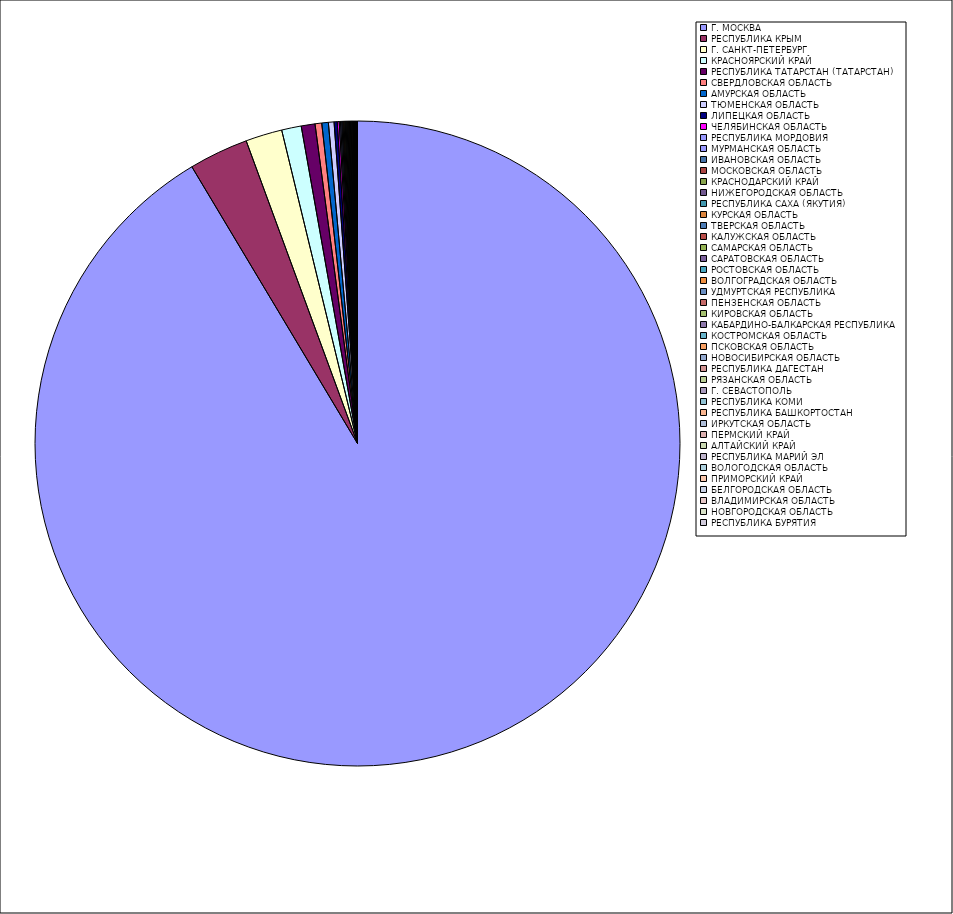
| Category | Оборот |
|---|---|
| Г. МОСКВА | 91.402 |
| РЕСПУБЛИКА КРЫМ | 2.975 |
| Г. САНКТ-ПЕТЕРБУРГ | 1.832 |
| КРАСНОЯРСКИЙ КРАЙ | 0.983 |
| РЕСПУБЛИКА ТАТАРСТАН (ТАТАРСТАН) | 0.689 |
| СВЕРДЛОВСКАЯ ОБЛАСТЬ | 0.335 |
| АМУРСКАЯ ОБЛАСТЬ | 0.328 |
| ТЮМЕНСКАЯ ОБЛАСТЬ | 0.283 |
| ЛИПЕЦКАЯ ОБЛАСТЬ | 0.157 |
| ЧЕЛЯБИНСКАЯ ОБЛАСТЬ | 0.097 |
| РЕСПУБЛИКА МОРДОВИЯ | 0.065 |
| МУРМАНСКАЯ ОБЛАСТЬ | 0.062 |
| ИВАНОВСКАЯ ОБЛАСТЬ | 0.055 |
| МОСКОВСКАЯ ОБЛАСТЬ | 0.054 |
| КРАСНОДАРСКИЙ КРАЙ | 0.053 |
| НИЖЕГОРОДСКАЯ ОБЛАСТЬ | 0.049 |
| РЕСПУБЛИКА САХА (ЯКУТИЯ) | 0.048 |
| КУРСКАЯ ОБЛАСТЬ | 0.043 |
| ТВЕРСКАЯ ОБЛАСТЬ | 0.042 |
| КАЛУЖСКАЯ ОБЛАСТЬ | 0.041 |
| САМАРСКАЯ ОБЛАСТЬ | 0.04 |
| САРАТОВСКАЯ ОБЛАСТЬ | 0.039 |
| РОСТОВСКАЯ ОБЛАСТЬ | 0.038 |
| ВОЛГОГРАДСКАЯ ОБЛАСТЬ | 0.038 |
| УДМУРТСКАЯ РЕСПУБЛИКА | 0.023 |
| ПЕНЗЕНСКАЯ ОБЛАСТЬ | 0.021 |
| КИРОВСКАЯ ОБЛАСТЬ | 0.018 |
| КАБАРДИНО-БАЛКАРСКАЯ РЕСПУБЛИКА | 0.017 |
| КОСТРОМСКАЯ ОБЛАСТЬ | 0.014 |
| ПСКОВСКАЯ ОБЛАСТЬ | 0.012 |
| НОВОСИБИРСКАЯ ОБЛАСТЬ | 0.011 |
| РЕСПУБЛИКА ДАГЕСТАН | 0.011 |
| РЯЗАНСКАЯ ОБЛАСТЬ | 0.011 |
| Г. СЕВАСТОПОЛЬ | 0.01 |
| РЕСПУБЛИКА КОМИ | 0.01 |
| РЕСПУБЛИКА БАШКОРТОСТАН | 0.009 |
| ИРКУТСКАЯ ОБЛАСТЬ | 0.009 |
| ПЕРМСКИЙ КРАЙ | 0.008 |
| АЛТАЙСКИЙ КРАЙ | 0.008 |
| РЕСПУБЛИКА МАРИЙ ЭЛ | 0.007 |
| ВОЛОГОДСКАЯ ОБЛАСТЬ | 0.007 |
| ПРИМОРСКИЙ КРАЙ | 0.007 |
| БЕЛГОРОДСКАЯ ОБЛАСТЬ | 0.007 |
| ВЛАДИМИРСКАЯ ОБЛАСТЬ | 0.007 |
| НОВГОРОДСКАЯ ОБЛАСТЬ | 0.007 |
| РЕСПУБЛИКА БУРЯТИЯ | 0.006 |